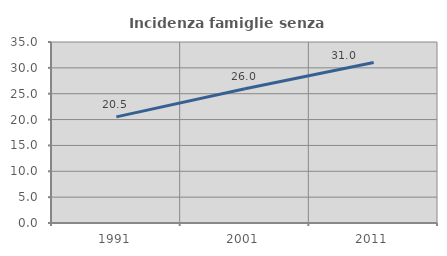
| Category | Incidenza famiglie senza nuclei |
|---|---|
| 1991.0 | 20.526 |
| 2001.0 | 25.952 |
| 2011.0 | 31.049 |